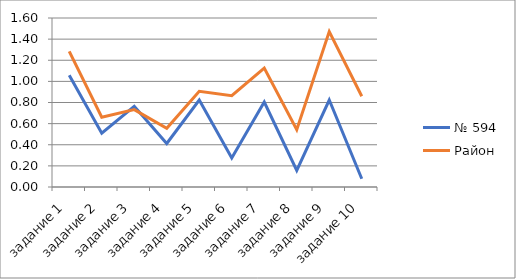
| Category | № 594 | Район |
|---|---|---|
| задание 1 | 1.059 | 1.284 |
| задание 2 | 0.51 | 0.661 |
| задание 3 | 0.765 | 0.733 |
| задание 4 | 0.412 | 0.555 |
| задание 5 | 0.824 | 0.906 |
| задание 6 | 0.275 | 0.865 |
| задание 7 | 0.804 | 1.127 |
| задание 8 | 0.157 | 0.543 |
| задание 9 | 0.824 | 1.472 |
| задание 10 | 0.078 | 0.859 |